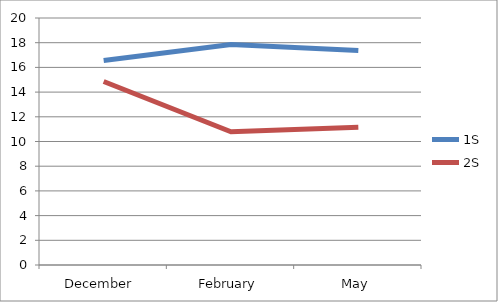
| Category | 1S | 2S |
|---|---|---|
| December  | 16.551 | 14.857 |
| February | 17.862 | 10.786 |
| May | 17.364 | 11.152 |